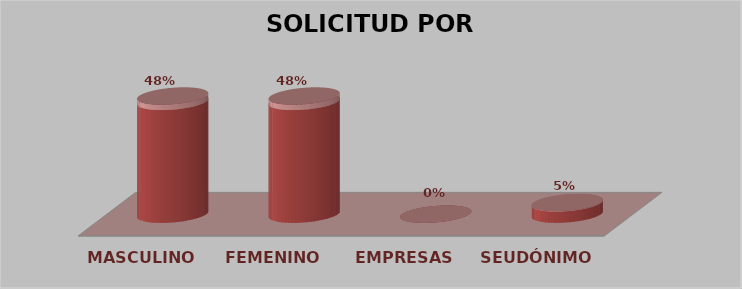
| Category | SOLICITUD POR GÉNERO | Series 1 |
|---|---|---|
| MASCULINO | 10 | 0.476 |
| FEMENINO | 10 | 0.476 |
| EMPRESAS | 0 | 0 |
| SEUDÓNIMO | 1 | 0.048 |